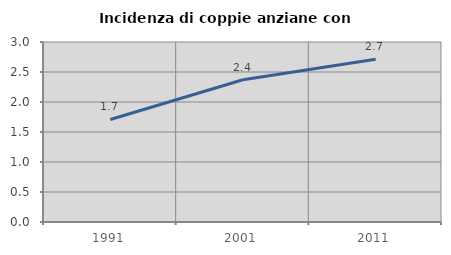
| Category | Incidenza di coppie anziane con figli |
|---|---|
| 1991.0 | 1.709 |
| 2001.0 | 2.372 |
| 2011.0 | 2.711 |